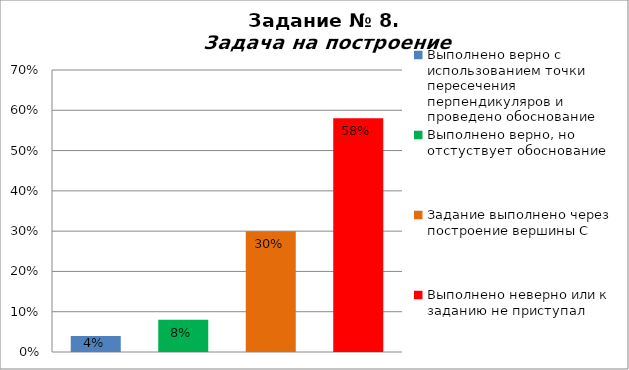
| Category | Задача на построение |
|---|---|
| Выполнено верно с использованием точки пересечения перпендикуляров и проведено обоснование | 0.04 |
| Выполнено верно, но отстуствует обоснование | 0.08 |
| Задание выполнено через построение вершины С | 0.3 |
| Выполнено неверно или к заданию не приступал | 0.58 |